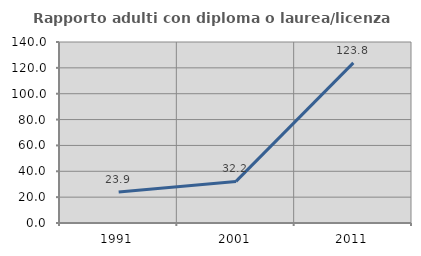
| Category | Rapporto adulti con diploma o laurea/licenza media  |
|---|---|
| 1991.0 | 23.89 |
| 2001.0 | 32.167 |
| 2011.0 | 123.817 |